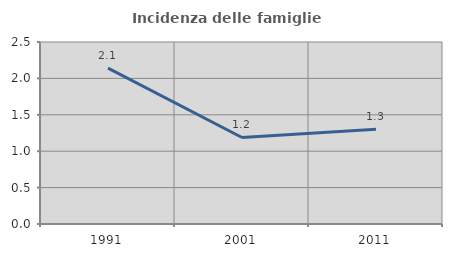
| Category | Incidenza delle famiglie numerose |
|---|---|
| 1991.0 | 2.14 |
| 2001.0 | 1.188 |
| 2011.0 | 1.3 |